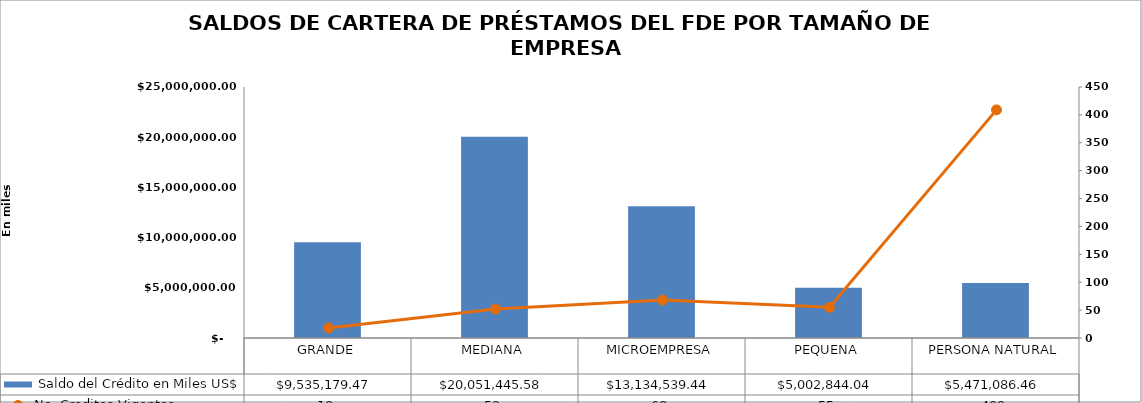
| Category |  Saldo del Crédito en Miles US$ |
|---|---|
| GRANDE | 9535179.47 |
| MEDIANA | 20051445.58 |
| MICROEMPRESA | 13134539.44 |
| PEQUENA | 5002844.04 |
| PERSONA NATURAL | 5471086.46 |